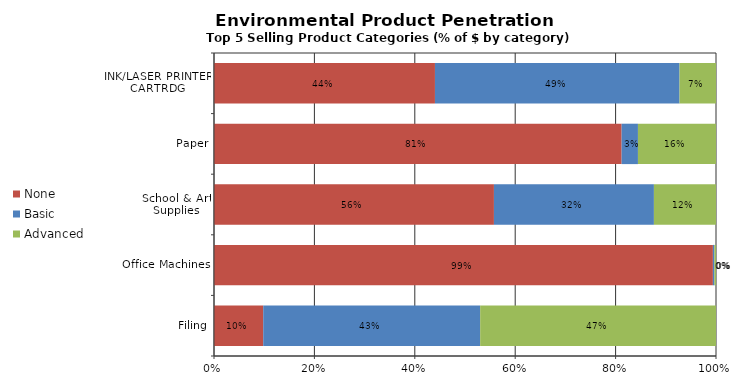
| Category | None | Basic | Advanced |
|---|---|---|---|
| INK/LASER PRINTER CARTRDG | 0.44 | 0.487 | 0.073 |
| Paper | 0.812 | 0.033 | 0.155 |
| School & Art Supplies | 0.558 | 0.319 | 0.124 |
| Office Machines | 0.994 | 0.003 | 0.003 |
| Filing | 0.098 | 0.432 | 0.47 |